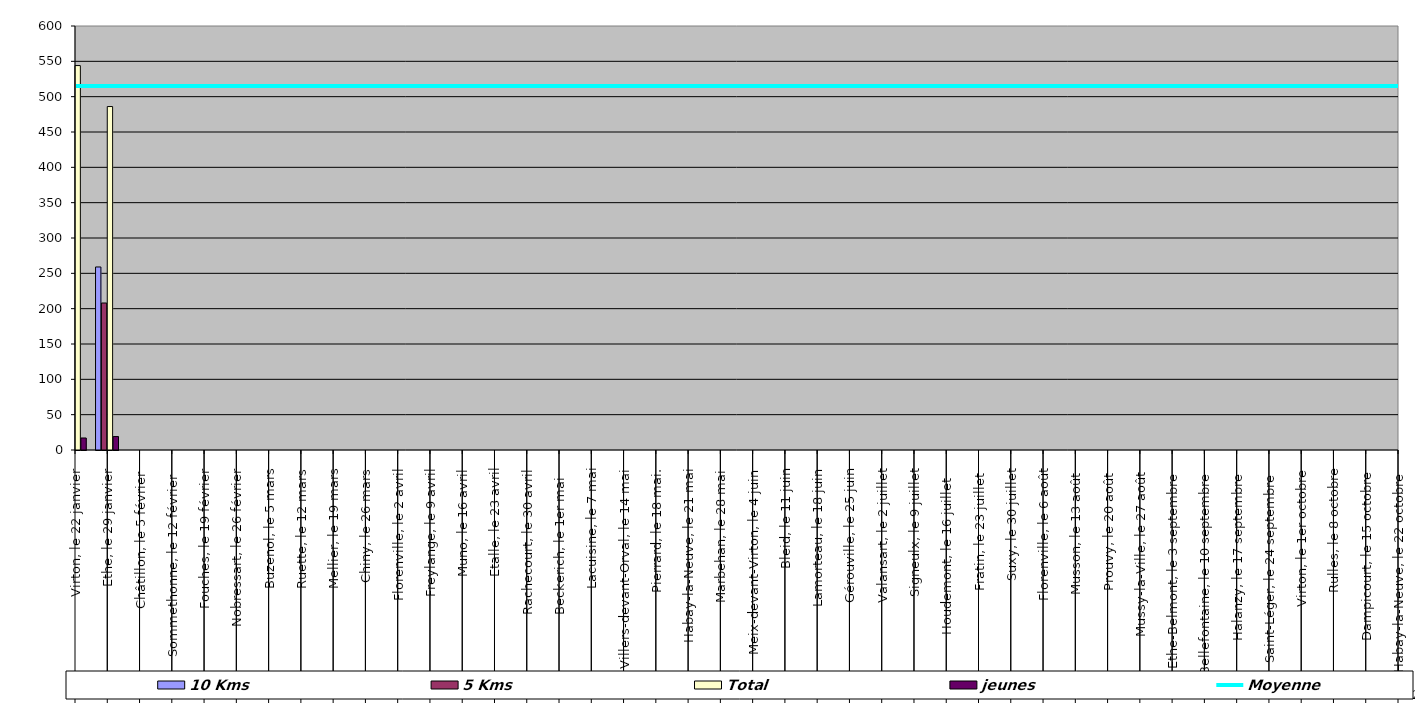
| Category | 10 Kms | 5 Kms | Total | jeunes |
|---|---|---|---|---|
| 0 | 296 | 231 | 544 | 17 |
| 1 | 259 | 208 | 486 | 19 |
| 2 | 0 | 0 | 0 | 0 |
| 3 | 0 | 0 | 0 | 0 |
| 4 | 0 | 0 | 0 | 0 |
| 5 | 0 | 0 | 0 | 0 |
| 6 | 0 | 0 | 0 | 0 |
| 7 | 0 | 0 | 0 | 0 |
| 8 | 0 | 0 | 0 | 0 |
| 9 | 0 | 0 | 0 | 0 |
| 10 | 0 | 0 | 0 | 0 |
| 11 | 0 | 0 | 0 | 0 |
| 12 | 0 | 0 | 0 | 0 |
| 13 | 0 | 0 | 0 | 0 |
| 14 | 0 | 0 | 0 | 0 |
| 15 | 0 | 0 | 0 | 0 |
| 16 | 0 | 0 | 0 | 0 |
| 17 | 0 | 0 | 0 | 0 |
| 18 | 0 | 0 | 0 | 0 |
| 19 | 0 | 0 | 0 | 0 |
| 20 | 0 | 0 | 0 | 0 |
| 21 | 0 | 0 | 0 | 0 |
| 22 | 0 | 0 | 0 | 0 |
| 23 | 0 | 0 | 0 | 0 |
| 24 | 0 | 0 | 0 | 0 |
| 25 | 0 | 0 | 0 | 0 |
| 26 | 0 | 0 | 0 | 0 |
| 27 | 0 | 0 | 0 | 0 |
| 28 | 0 | 0 | 0 | 0 |
| 29 | 0 | 0 | 0 | 0 |
| 30 | 0 | 0 | 0 | 0 |
| 31 | 0 | 0 | 0 | 0 |
| 32 | 0 | 0 | 0 | 0 |
| 33 | 0 | 0 | 0 | 0 |
| 34 | 0 | 0 | 0 | 0 |
| 35 | 0 | 0 | 0 | 0 |
| 36 | 0 | 0 | 0 | 0 |
| 37 | 0 | 0 | 0 | 0 |
| 38 | 0 | 0 | 0 | 0 |
| 39 | 0 | 0 | 0 | 0 |
| 40 | 0 | 0 | 0 | 0 |
| 41 | 0 | 0 | 0 | 0 |